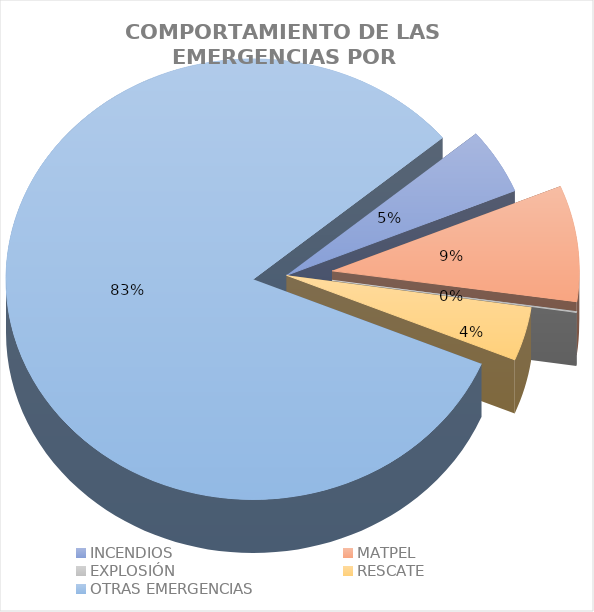
| Category | Series 0 |
|---|---|
| INCENDIOS | 0.048 |
| MATPEL | 0.085 |
| EXPLOSIÓN | 0.001 |
| RESCATE | 0.039 |
| OTRAS EMERGENCIAS | 0.826 |